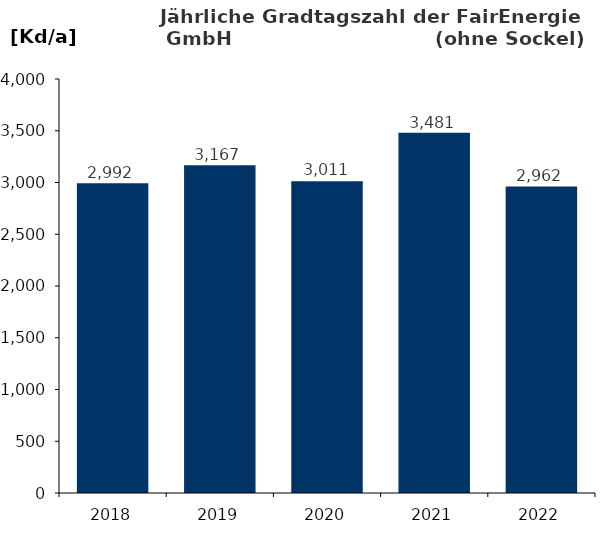
| Category | Gradtagszahl |
|---|---|
| 2018.0 | 2992.3 |
| 2019.0 | 3166.7 |
| 2020.0 | 3011 |
| 2021.0 | 3480.7 |
| 2022.0 | 2961.8 |